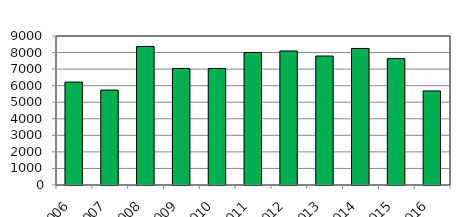
| Category |   |
|---|---|
| 2006 | 6218 |
| 2007 | 5734 |
| 2008 | 8363 |
| 2009 | 7040 |
| 2010 | 7039 |
| 2011 | 8006 |
| 2012 | 8096 |
| 2013 | 7791 |
| 2014 | 8246 |
| 2015 | 7636 |
| 2016 | 5683 |